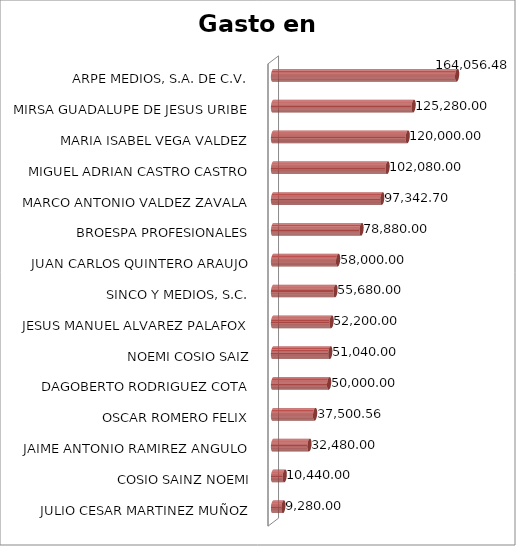
| Category | Suma |
|---|---|
| JULIO CESAR MARTINEZ MUÑOZ | 9280 |
| COSIO SAINZ NOEMI | 10440 |
| JAIME ANTONIO RAMIREZ ANGULO | 32480 |
| OSCAR ROMERO FELIX | 37500.56 |
| DAGOBERTO RODRIGUEZ COTA | 50000 |
| NOEMI COSIO SAIZ | 51040 |
| JESUS MANUEL ALVAREZ PALAFOX | 52200 |
| SINCO Y MEDIOS, S.C. | 55680 |
| JUAN CARLOS QUINTERO ARAUJO | 58000 |
| BROESPA PROFESIONALES | 78880 |
| MARCO ANTONIO VALDEZ ZAVALA | 97342.7 |
| MIGUEL ADRIAN CASTRO CASTRO | 102080 |
| MARIA ISABEL VEGA VALDEZ | 120000 |
| MIRSA GUADALUPE DE JESUS URIBE | 125280 |
| ARPE MEDIOS, S.A. DE C.V. | 164056.48 |